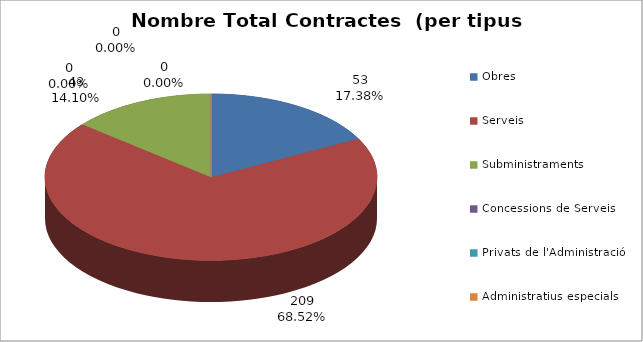
| Category | Nombre Total Contractes |
|---|---|
| Obres | 53 |
| Serveis | 209 |
| Subministraments | 43 |
| Concessions de Serveis | 0 |
| Privats de l'Administració | 0 |
| Administratius especials | 0 |